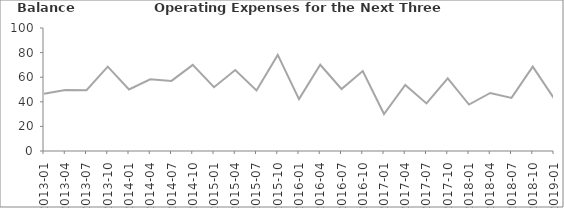
| Category | Balance |
|---|---|
| 2013-01 | 46.5 |
| 2013-04 | 49.6 |
| 2013-07 | 49.4 |
| 2013-10 | 68.6 |
| 2014-01 | 50 |
| 2014-04 | 58.3 |
| 2014-07 | 57 |
| 2014-10 | 70 |
| 2015-01 | 51.9 |
| 2015-04 | 65.8 |
| 2015-07 | 49.2 |
| 2015-10 | 78.1 |
| 2016-01 | 42.2 |
| 2016-04 | 70.1 |
| 2016-07 | 50.4 |
| 2016-10 | 65 |
| 2017-01 | 30.1 |
| 2017-04 | 53.7 |
| 2017-07 | 38.7 |
| 2017-10 | 59.1 |
| 2018-01 | 37.8 |
| 2018-04 | 47.2 |
| 2018-07 | 43.2 |
| 2018-10 | 68.6 |
| 2019-01 | 42.8 |